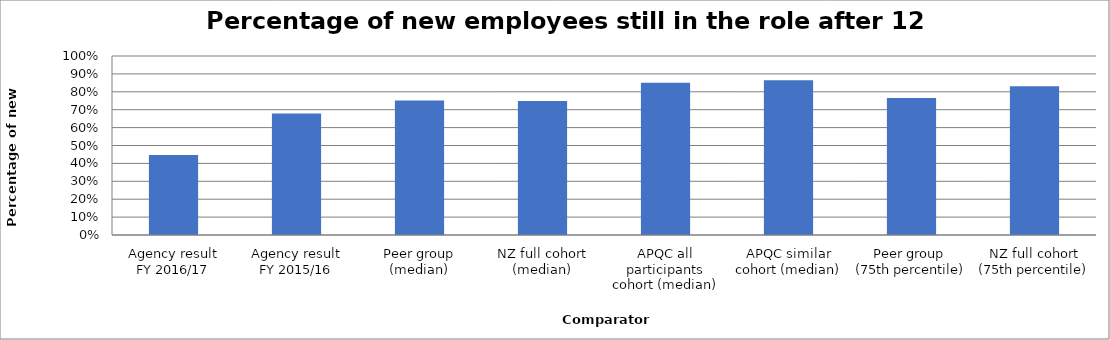
| Category | Result |
|---|---|
| Agency result
FY 2016/17 | 0.447 |
| Agency result
FY 2015/16 | 0.679 |
| Peer group (median) | 0.751 |
| NZ full cohort (median) | 0.748 |
| APQC all participants cohort (median) | 0.85 |
| APQC similar cohort (median) | 0.865 |
| Peer group 
(75th percentile) | 0.766 |
| NZ full cohort (75th percentile) | 0.832 |